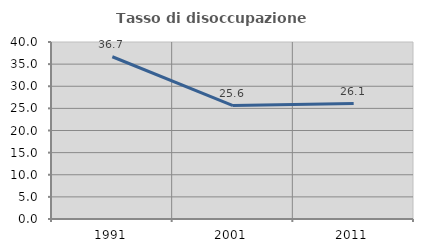
| Category | Tasso di disoccupazione giovanile  |
|---|---|
| 1991.0 | 36.667 |
| 2001.0 | 25.641 |
| 2011.0 | 26.087 |